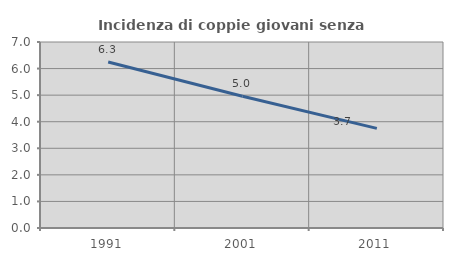
| Category | Incidenza di coppie giovani senza figli |
|---|---|
| 1991.0 | 6.25 |
| 2001.0 | 4.958 |
| 2011.0 | 3.749 |